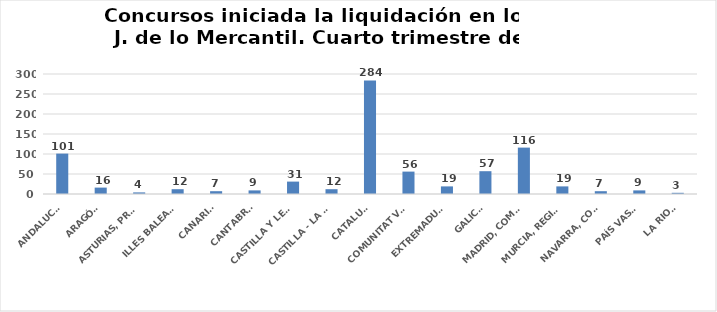
| Category | Series 0 |
|---|---|
| ANDALUCÍA | 101 |
| ARAGÓN | 16 |
| ASTURIAS, PRINCIPADO | 4 |
| ILLES BALEARS | 12 |
| CANARIAS | 7 |
| CANTABRIA | 9 |
| CASTILLA Y LEÓN | 31 |
| CASTILLA - LA MANCHA | 12 |
| CATALUÑA | 284 |
| COMUNITAT VALENCIANA | 56 |
| EXTREMADURA | 19 |
| GALICIA | 57 |
| MADRID, COMUNIDAD | 116 |
| MURCIA, REGIÓN | 19 |
| NAVARRA, COM. FORAL | 7 |
| PAÍS VASCO | 9 |
| LA RIOJA | 3 |